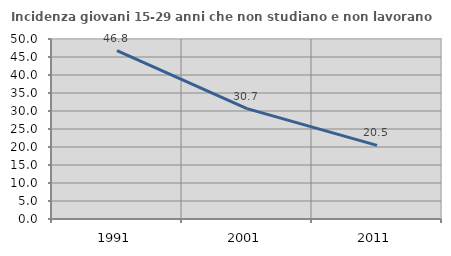
| Category | Incidenza giovani 15-29 anni che non studiano e non lavorano  |
|---|---|
| 1991.0 | 46.789 |
| 2001.0 | 30.667 |
| 2011.0 | 20.455 |